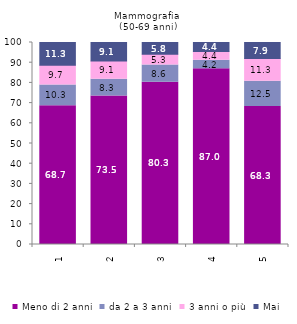
| Category | Meno di 2 anni | da 2 a 3 anni | 3 anni o più | Mai |
|---|---|---|---|---|
| 0 | 68.7 | 10.3 | 9.7 | 11.3 |
| 1 | 73.5 | 8.3 | 9.1 | 9.1 |
| 2 | 80.3 | 8.6 | 5.3 | 5.8 |
| 3 | 87 | 4.2 | 4.4 | 4.4 |
| 4 | 68.3 | 12.5 | 11.3 | 7.9 |